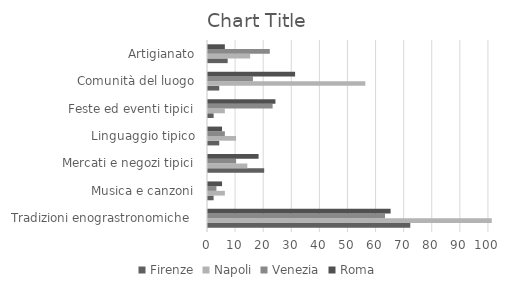
| Category | Firenze | Napoli | Venezia | Roma |
|---|---|---|---|---|
| Tradizioni enograstronomiche  | 72 | 101 | 63 | 65 |
| Musica e canzoni | 2 | 6 | 3 | 5 |
| Mercati e negozi tipici | 20 | 14 | 10 | 18 |
| Linguaggio tipico | 4 | 10 | 6 | 5 |
| Feste ed eventi tipici | 2 | 6 | 23 | 24 |
| Comunità del luogo | 4 | 56 | 16 | 31 |
| Artigianato | 7 | 15 | 22 | 6 |